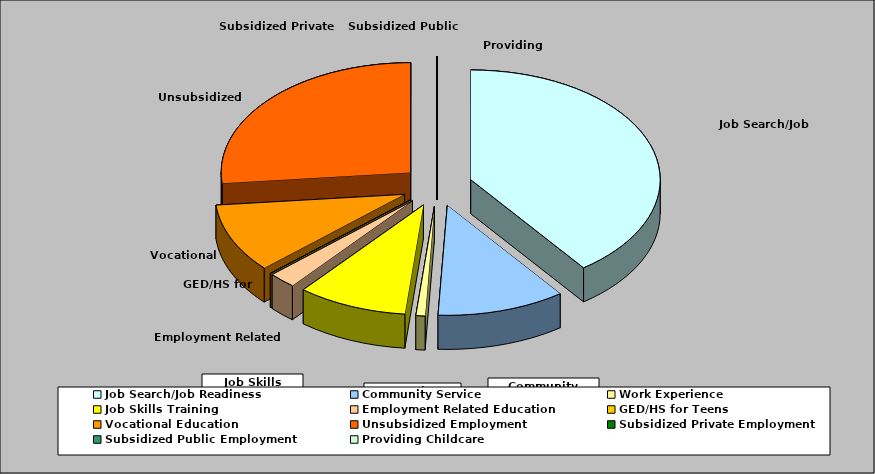
| Category | Series 0 |
|---|---|
| Job Search/Job Readiness | 0.398 |
| Community Service | 0.109 |
| Work Experience | 0.008 |
| Job Skills Training | 0.094 |
| Employment Related Education | 0.023 |
| GED/HS for Teens | 0 |
| Vocational Education | 0.102 |
| Unsubsidized Employment | 0.266 |
| Subsidized Private Employment | 0 |
| Subsidized Public Employment | 0 |
| Providing Childcare | 0 |